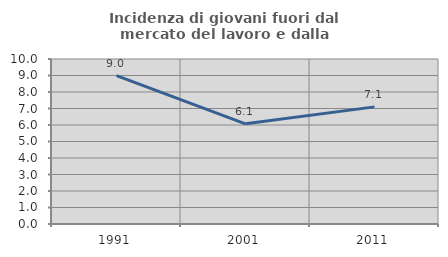
| Category | Incidenza di giovani fuori dal mercato del lavoro e dalla formazione  |
|---|---|
| 1991.0 | 8.992 |
| 2001.0 | 6.07 |
| 2011.0 | 7.099 |